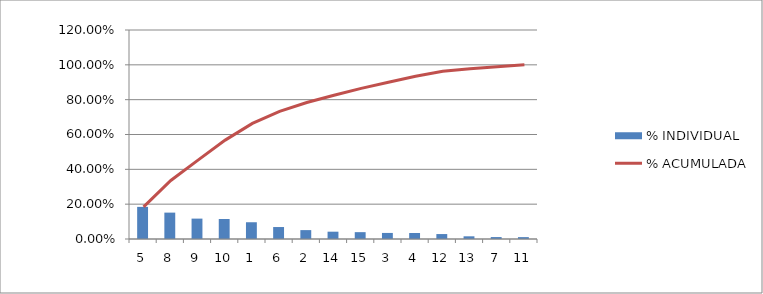
| Category | % INDIVIDUAL |
|---|---|
| 5.0 | 0.184 |
| 8.0 | 0.151 |
| 9.0 | 0.117 |
| 10.0 | 0.115 |
| 1.0 | 0.096 |
| 6.0 | 0.069 |
| 2.0 | 0.051 |
| 14.0 | 0.042 |
| 15.0 | 0.039 |
| 3.0 | 0.035 |
| 4.0 | 0.034 |
| 12.0 | 0.028 |
| 13.0 | 0.015 |
| 7.0 | 0.011 |
| 11.0 | 0.011 |